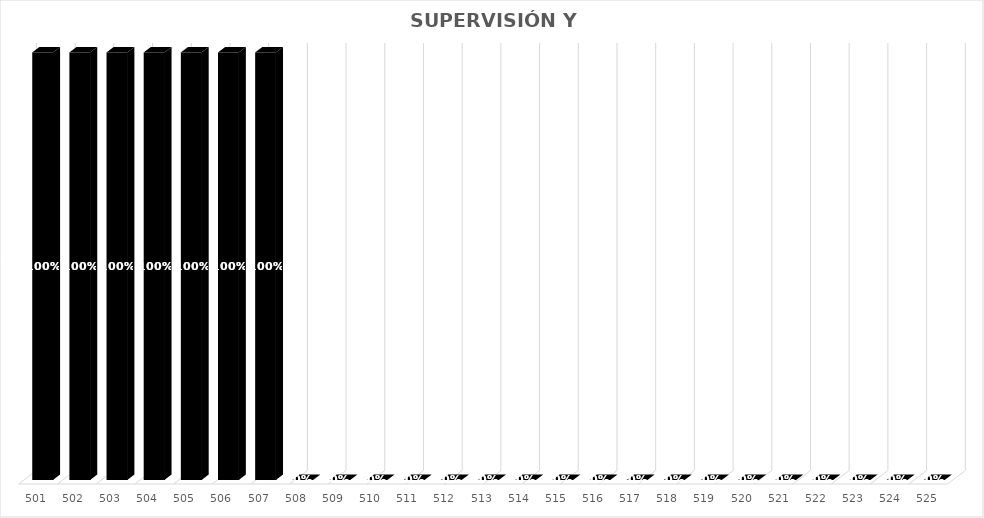
| Category | % Avance |
|---|---|
| 501.0 | 1 |
| 502.0 | 1 |
| 503.0 | 1 |
| 504.0 | 1 |
| 505.0 | 1 |
| 506.0 | 1 |
| 507.0 | 1 |
| 508.0 | 0 |
| 509.0 | 0 |
| 510.0 | 0 |
| 511.0 | 0 |
| 512.0 | 0 |
| 513.0 | 0 |
| 514.0 | 0 |
| 515.0 | 0 |
| 516.0 | 0 |
| 517.0 | 0 |
| 518.0 | 0 |
| 519.0 | 0 |
| 520.0 | 0 |
| 521.0 | 0 |
| 522.0 | 0 |
| 523.0 | 0 |
| 524.0 | 0 |
| 525.0 | 0 |